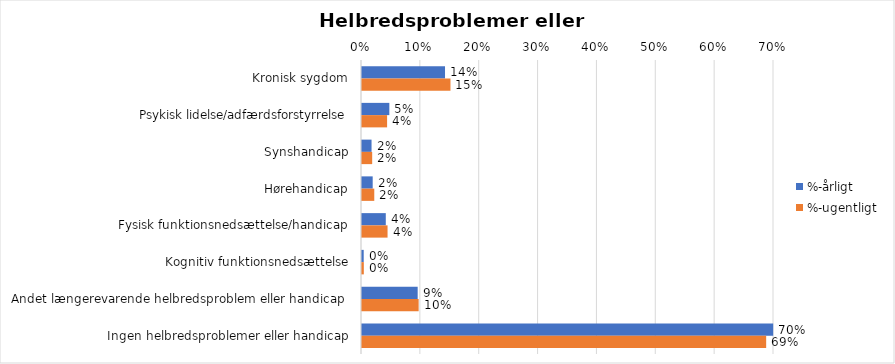
| Category | %-årligt | %-ugentligt |
|---|---|---|
| Kronisk sygdom | 0.141 | 0.15 |
| Psykisk lidelse/adfærdsforstyrrelse | 0.046 | 0.043 |
| Synshandicap | 0.016 | 0.017 |
| Hørehandicap | 0.018 | 0.021 |
| Fysisk funktionsnedsættelse/handicap | 0.04 | 0.043 |
| Kognitiv funktionsnedsættelse | 0.003 | 0.003 |
| Andet længerevarende helbredsproblem eller handicap  | 0.095 | 0.096 |
| Ingen helbredsproblemer eller handicap | 0.699 | 0.687 |